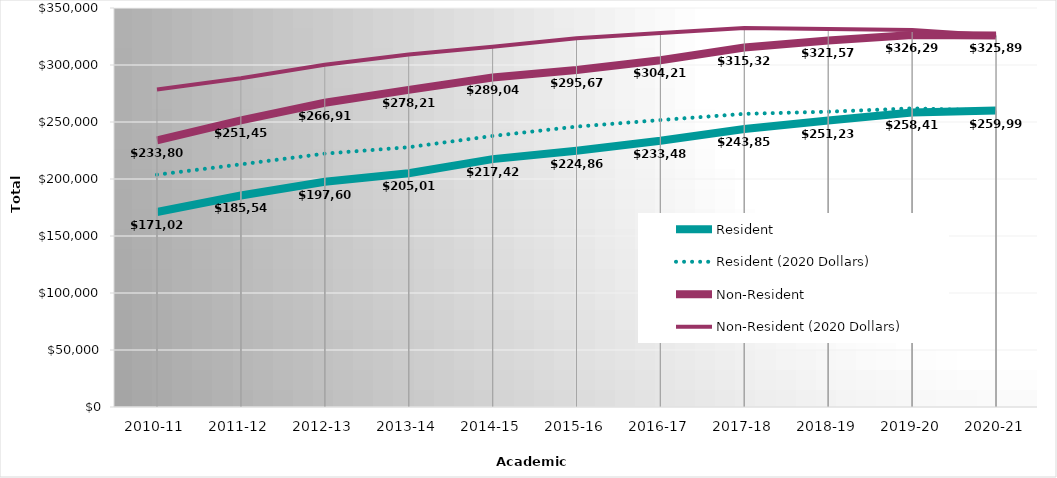
| Category | Resident | Resident (2020 Dollars) | Non-Resident | Non-Resident (2020 Dollars) |
|---|---|---|---|---|
| 2010-11 | 171023 | 203781.669 | 233808 | 278592.846 |
| 2011-12 | 185545 | 212851.442 | 251457 | 288463.635 |
| 2012-13 | 197604 | 222259.356 | 266914 | 300217.272 |
| 2013-14 | 205010 | 227889.082 | 278217 | 309265.971 |
| 2014-15 | 217423 | 237745.741 | 289042 | 316059.039 |
| 2015-16 | 224860.11 | 245966.872 | 295678.13 | 323432.309 |
| 2016-17 | 233479.65 | 251711.006 | 304212.15 | 327966.682 |
| 2017-18 | 243850 | 257149.109 | 315322 | 332519.054 |
| 2018-19 | 251233 | 259036.555 | 321575 | 331563.45 |
| 2019-20 | 258412 | 261955.686 | 326294 | 330768.573 |
| 2020-21 | 259989.68 | 259989.68 | 325891.32 | 325891.32 |